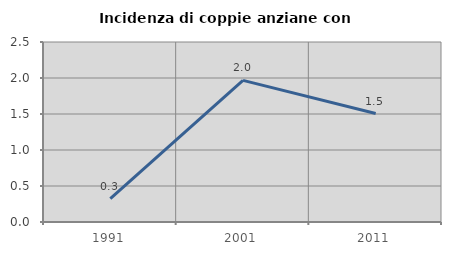
| Category | Incidenza di coppie anziane con figli |
|---|---|
| 1991.0 | 0.326 |
| 2001.0 | 1.967 |
| 2011.0 | 1.506 |